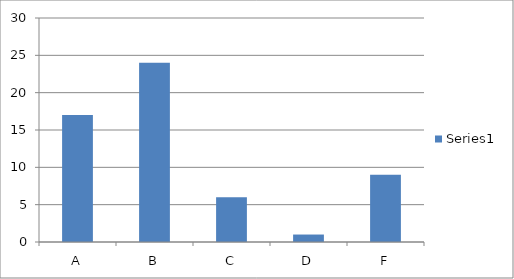
| Category | Series 0 |
|---|---|
| A | 17 |
| B | 24 |
| C | 6 |
| D | 1 |
| F | 9 |